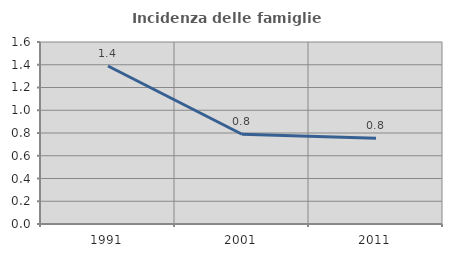
| Category | Incidenza delle famiglie numerose |
|---|---|
| 1991.0 | 1.389 |
| 2001.0 | 0.789 |
| 2011.0 | 0.753 |